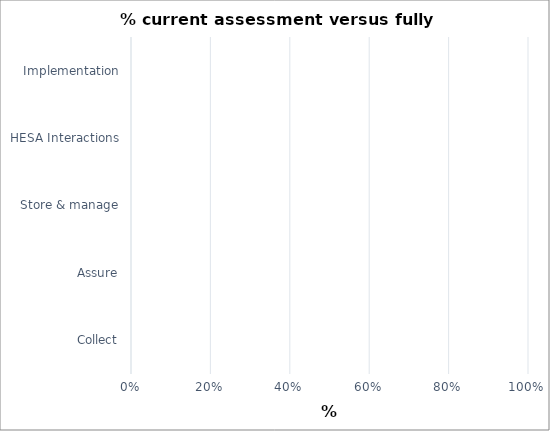
| Category | % readiness |
|---|---|
| Collect | 0 |
| Assure | 0 |
| Store & manage | 0 |
| HESA Interactions | 0 |
| Implementation | 0 |